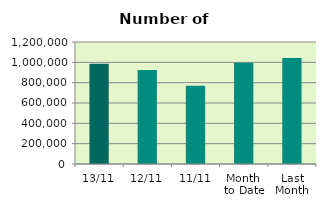
| Category | Series 0 |
|---|---|
| 13/11 | 987036 |
| 12/11 | 924886 |
| 11/11 | 769004 |
| Month 
to Date | 995153.778 |
| Last
Month | 1042648 |